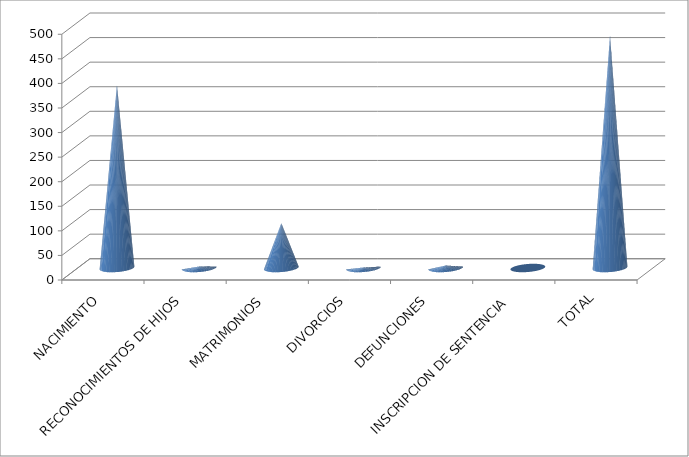
| Category | Series 0 |
|---|---|
| NACIMIENTO | 372 |
| RECONOCIMIENTOS DE HIJOS | 3 |
| MATRIMONIOS | 91 |
| DIVORCIOS | 1 |
| DEFUNCIONES | 5 |
| INSCRIPCION DE SENTENCIA | 0 |
| TOTAL | 472 |